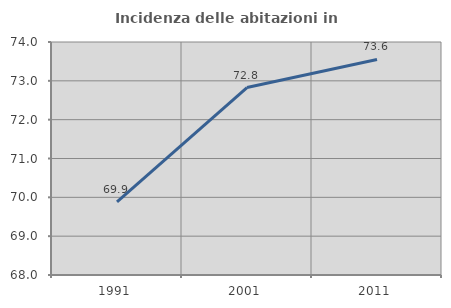
| Category | Incidenza delle abitazioni in proprietà  |
|---|---|
| 1991.0 | 69.883 |
| 2001.0 | 72.826 |
| 2011.0 | 73.552 |